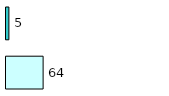
| Category | Series 0 | Series 1 |
|---|---|---|
| 0 | 64 | 5 |